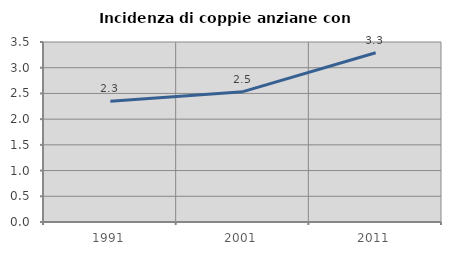
| Category | Incidenza di coppie anziane con figli |
|---|---|
| 1991.0 | 2.347 |
| 2001.0 | 2.535 |
| 2011.0 | 3.291 |